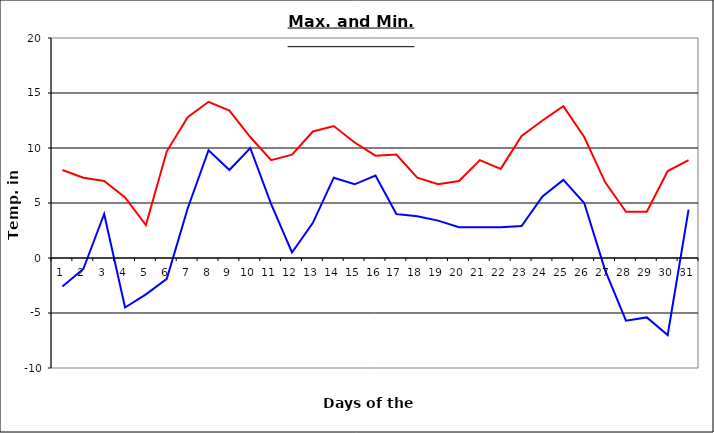
| Category | Series 0 | Series 1 |
|---|---|---|
| 0 | 8 | -2.6 |
| 1 | 7.3 | -1 |
| 2 | 7 | 4 |
| 3 | 5.5 | -4.5 |
| 4 | 3 | -3.3 |
| 5 | 9.7 | -1.9 |
| 6 | 12.8 | 4.5 |
| 7 | 14.2 | 9.8 |
| 8 | 13.4 | 8 |
| 9 | 11 | 10 |
| 10 | 8.9 | 4.9 |
| 11 | 9.4 | 0.5 |
| 12 | 11.5 | 3.2 |
| 13 | 12 | 7.3 |
| 14 | 10.5 | 6.7 |
| 15 | 9.3 | 7.5 |
| 16 | 9.4 | 4 |
| 17 | 7.3 | 3.8 |
| 18 | 6.7 | 3.4 |
| 19 | 7 | 2.8 |
| 20 | 8.9 | 2.8 |
| 21 | 8.1 | 2.8 |
| 22 | 11.1 | 2.9 |
| 23 | 12.5 | 5.6 |
| 24 | 13.8 | 7.1 |
| 25 | 11 | 5 |
| 26 | 6.9 | -1.1 |
| 27 | 4.2 | -5.7 |
| 28 | 4.2 | -5.4 |
| 29 | 7.9 | -7 |
| 30 | 8.9 | 4.4 |